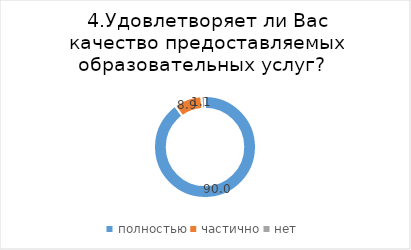
| Category | Series 0 |
|---|---|
| полностью | 90 |
| частично | 8.889 |
| нет | 1.111 |